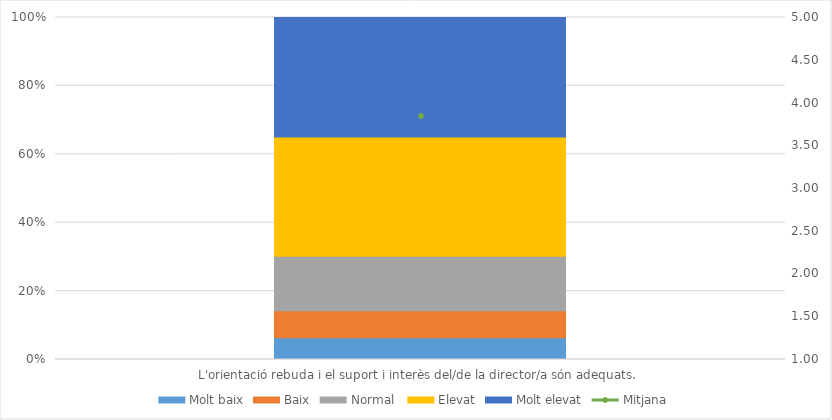
| Category | Molt baix | Baix | Normal  | Elevat | Molt elevat |
|---|---|---|---|---|---|
| L'orientació rebuda i el suport i interès del/de la director/a són adequats. | 4 | 5 | 10 | 22 | 22 |